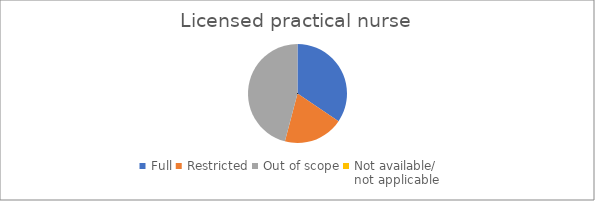
| Category | Licensed practical nurse | Nurse practitioner | Registered nurse |
|---|---|---|---|
| Full | 21 | 0 | 24 |
| Restricted | 12 | 0 | 18 |
| Out of scope | 28 | 0 | 19 |
| Not available/
not applicable | 0 | 0 | 0 |